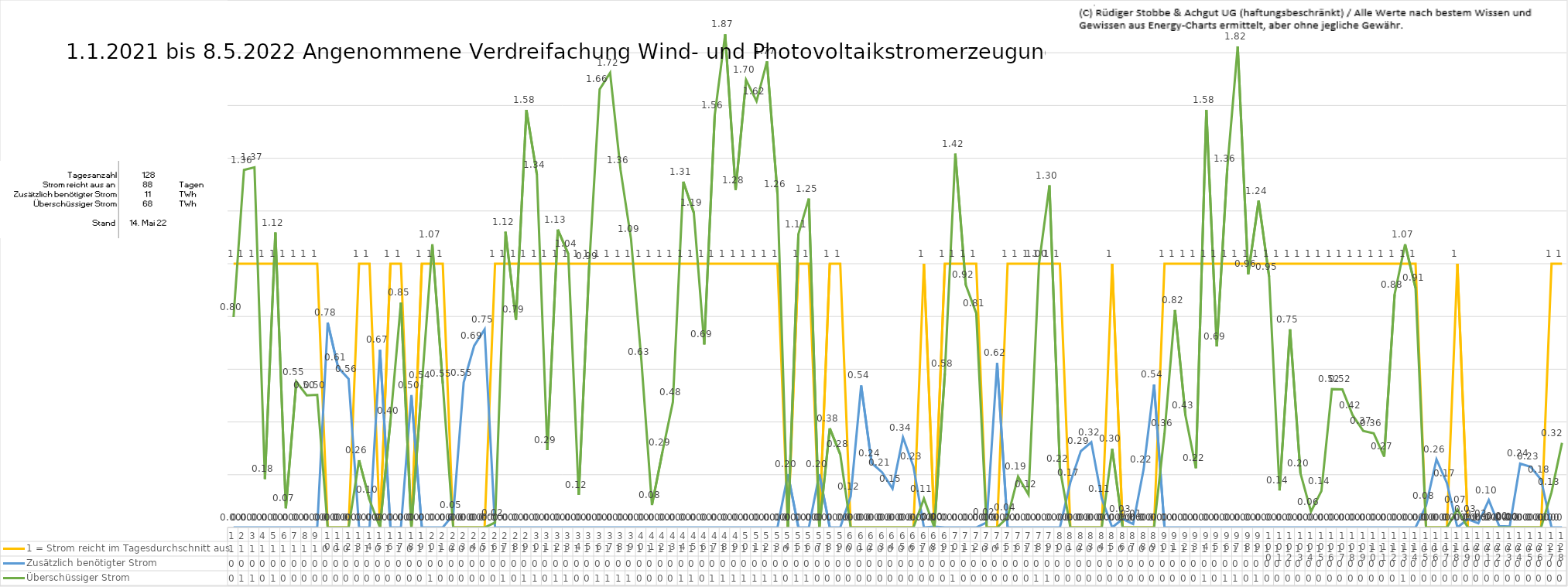
| Category | 1 = Strom reicht im Tagesdurchschnitt aus | Zusätzlich benötigter Strom | Überschüssiger Strom |
|---|---|---|---|
| 0 | 1 | 0 | 0.798 |
| 1 | 1 | 0 | 1.356 |
| 2 | 1 | 0 | 1.366 |
| 3 | 1 | 0 | 0.184 |
| 4 | 1 | 0 | 1.118 |
| 5 | 1 | 0 | 0.073 |
| 6 | 1 | 0 | 0.553 |
| 7 | 1 | 0 | 0.501 |
| 8 | 1 | 0 | 0.503 |
| 9 | 0 | 0.777 | 0 |
| 10 | 0 | 0.606 | 0 |
| 11 | 0 | 0.563 | 0 |
| 12 | 1 | 0 | 0.255 |
| 13 | 1 | 0 | 0.104 |
| 14 | 0 | 0.673 | 0 |
| 15 | 1 | 0 | 0.405 |
| 16 | 1 | 0 | 0.852 |
| 17 | 0 | 0.502 | 0 |
| 18 | 1 | 0 | 0.54 |
| 19 | 1 | 0 | 1.074 |
| 20 | 1 | 0 | 0.546 |
| 21 | 0 | 0.048 | 0 |
| 22 | 0 | 0.55 | 0 |
| 23 | 0 | 0.688 | 0 |
| 24 | 0 | 0.751 | 0 |
| 25 | 1 | 0 | 0.018 |
| 26 | 1 | 0 | 1.121 |
| 27 | 1 | 0 | 0.788 |
| 28 | 1 | 0 | 1.583 |
| 29 | 1 | 0 | 1.338 |
| 30 | 1 | 0 | 0.293 |
| 31 | 1 | 0 | 1.13 |
| 32 | 1 | 0 | 1.037 |
| 33 | 1 | 0 | 0.123 |
| 34 | 1 | 0 | 0.992 |
| 35 | 1 | 0 | 1.662 |
| 36 | 1 | 0 | 1.724 |
| 37 | 1 | 0 | 1.355 |
| 38 | 1 | 0 | 1.094 |
| 39 | 1 | 0 | 0.628 |
| 40 | 1 | 0 | 0.085 |
| 41 | 1 | 0 | 0.286 |
| 42 | 1 | 0 | 0.476 |
| 43 | 1 | 0 | 1.311 |
| 44 | 1 | 0 | 1.194 |
| 45 | 1 | 0 | 0.694 |
| 46 | 1 | 0 | 1.563 |
| 47 | 1 | 0 | 1.87 |
| 48 | 1 | 0 | 1.28 |
| 49 | 1 | 0 | 1.697 |
| 50 | 1 | 0 | 1.616 |
| 51 | 1 | 0 | 1.767 |
| 52 | 1 | 0 | 1.264 |
| 53 | 0 | 0.202 | 0 |
| 54 | 1 | 0 | 1.112 |
| 55 | 1 | 0 | 1.247 |
| 56 | 0 | 0.202 | 0 |
| 57 | 1 | 0 | 0.376 |
| 58 | 1 | 0 | 0.278 |
| 59 | 0 | 0.118 | 0 |
| 60 | 0 | 0.538 | 0 |
| 61 | 0 | 0.244 | 0 |
| 62 | 0 | 0.209 | 0 |
| 63 | 0 | 0.147 | 0 |
| 64 | 0 | 0.341 | 0 |
| 65 | 0 | 0.231 | 0 |
| 66 | 1 | 0 | 0.11 |
| 67 | 0 | 0.003 | 0 |
| 68 | 1 | 0 | 0.584 |
| 69 | 1 | 0 | 1.417 |
| 70 | 1 | 0 | 0.92 |
| 71 | 1 | 0 | 0.813 |
| 72 | 0 | 0.019 | 0 |
| 73 | 0 | 0.624 | 0 |
| 74 | 1 | 0 | 0.038 |
| 75 | 1 | 0 | 0.193 |
| 76 | 1 | 0 | 0.125 |
| 77 | 1 | 0 | 0.999 |
| 78 | 1 | 0 | 1.297 |
| 79 | 1 | 0 | 0.224 |
| 80 | 0 | 0.171 | 0 |
| 81 | 0 | 0.289 | 0 |
| 82 | 0 | 0.323 | 0 |
| 83 | 0 | 0.11 | 0 |
| 84 | 1 | 0 | 0.298 |
| 85 | 0 | 0.032 | 0 |
| 86 | 0 | 0.013 | 0 |
| 87 | 0 | 0.22 | 0 |
| 88 | 0 | 0.541 | 0 |
| 89 | 1 | 0 | 0.357 |
| 90 | 1 | 0 | 0.825 |
| 91 | 1 | 0 | 0.425 |
| 92 | 1 | 0 | 0.225 |
| 93 | 1 | 0 | 1.583 |
| 94 | 1 | 0 | 0.686 |
| 95 | 1 | 0 | 1.361 |
| 96 | 1 | 0 | 1.824 |
| 97 | 1 | 0 | 0.96 |
| 98 | 1 | 0 | 1.239 |
| 99 | 1 | 0 | 0.951 |
| 100 | 1 | 0 | 0.14 |
| 101 | 1 | 0 | 0.751 |
| 102 | 1 | 0 | 0.205 |
| 103 | 1 | 0 | 0.06 |
| 104 | 1 | 0 | 0.138 |
| 105 | 1 | 0 | 0.525 |
| 106 | 1 | 0 | 0.524 |
| 107 | 1 | 0 | 0.425 |
| 108 | 1 | 0 | 0.366 |
| 109 | 1 | 0 | 0.357 |
| 110 | 1 | 0 | 0.269 |
| 111 | 1 | 0 | 0.884 |
| 112 | 1 | 0 | 1.074 |
| 113 | 1 | 0 | 0.908 |
| 114 | 0 | 0.082 | 0 |
| 115 | 0 | 0.258 | 0 |
| 116 | 0 | 0.168 | 0 |
| 117 | 1 | 0 | 0.068 |
| 118 | 0 | 0.031 | 0 |
| 119 | 0 | 0.016 | 0 |
| 120 | 0 | 0.104 | 0 |
| 121 | 0 | 0.005 | 0 |
| 122 | 0 | 0.003 | 0 |
| 123 | 0 | 0.242 | 0 |
| 124 | 0 | 0.23 | 0 |
| 125 | 0 | 0.181 | 0 |
| 126 | 1 | 0 | 0.134 |
| 127 | 1 | 0 | 0.321 |